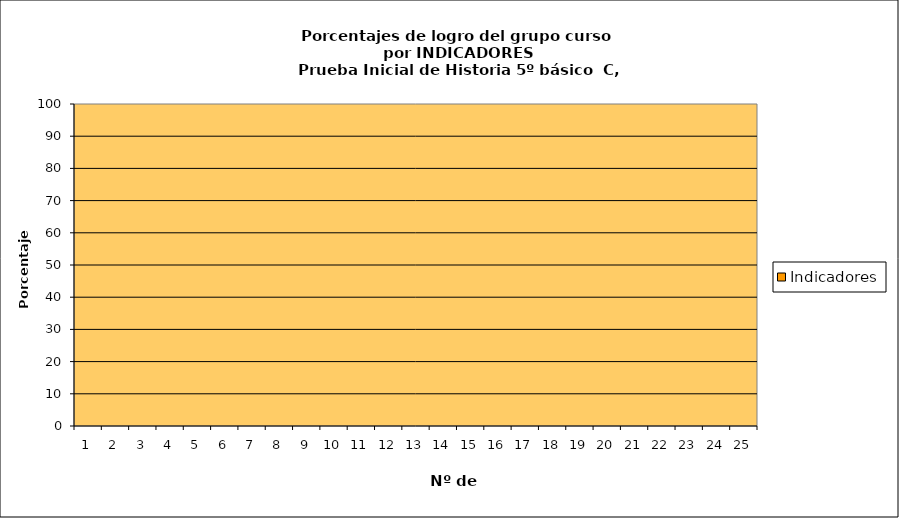
| Category | Indicadores |
|---|---|
| 0 | 0 |
| 1 | 0 |
| 2 | 0 |
| 3 | 0 |
| 4 | 0 |
| 5 | 0 |
| 6 | 0 |
| 7 | 0 |
| 8 | 0 |
| 9 | 0 |
| 10 | 0 |
| 11 | 0 |
| 12 | 0 |
| 13 | 0 |
| 14 | 0 |
| 15 | 0 |
| 16 | 0 |
| 17 | 0 |
| 18 | 0 |
| 19 | 0 |
| 20 | 0 |
| 21 | 0 |
| 22 | 0 |
| 23 | 0 |
| 24 | 0 |